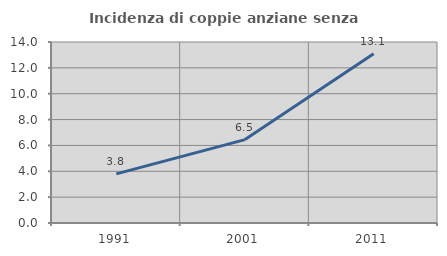
| Category | Incidenza di coppie anziane senza figli  |
|---|---|
| 1991.0 | 3.802 |
| 2001.0 | 6.452 |
| 2011.0 | 13.09 |